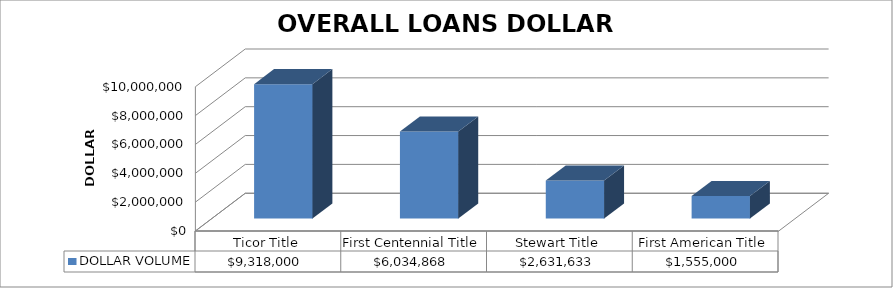
| Category | DOLLAR VOLUME |
|---|---|
| Ticor Title | 9318000 |
| First Centennial Title | 6034868 |
| Stewart Title | 2631633 |
| First American Title | 1555000 |